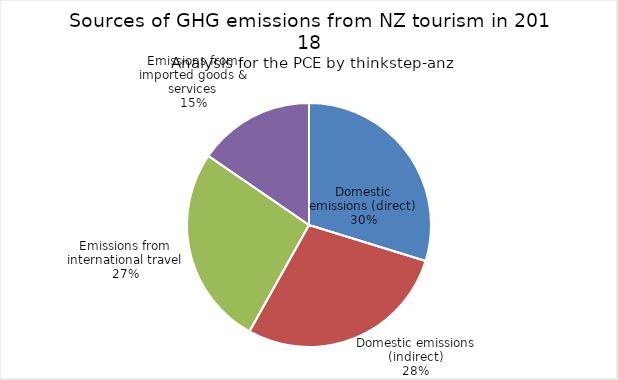
| Category | Series 0 |
|---|---|
| Domestic emissions (direct) | 3830.729 |
| Domestic emissions (indirect) | 3647.344 |
| Emissions from international travel | 3403.229 |
| Emissions from imported goods & services | 1985.999 |